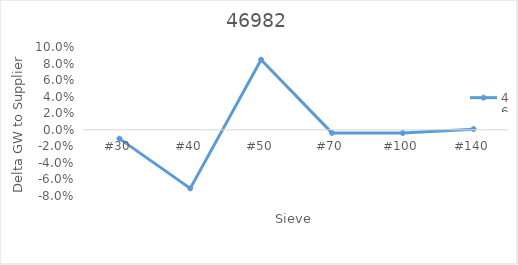
| Category | 46982 |
|---|---|
| #30 | -0.011 |
| #40 | -0.071 |
| #50 | 0.085 |
| #70 | -0.004 |
| #100 | -0.004 |
| #140 | 0.001 |